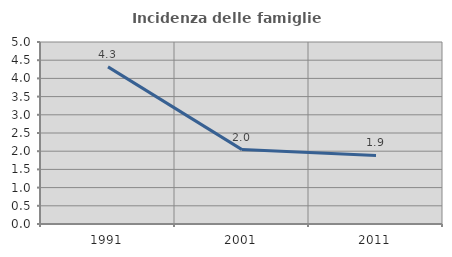
| Category | Incidenza delle famiglie numerose |
|---|---|
| 1991.0 | 4.317 |
| 2001.0 | 2.044 |
| 2011.0 | 1.883 |